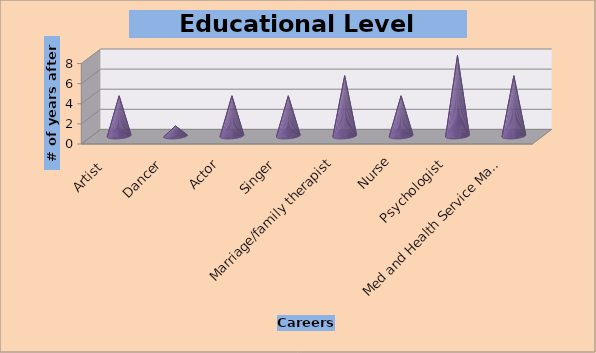
| Category | Educational Level Needed  No. of years after H.S. |
|---|---|
| Artist  | 4 |
| Dancer | 1 |
| Actor | 4 |
| Singer | 4 |
| Marriage/family therapist | 6 |
| Nurse | 4 |
| Psychologist | 8 |
| Med and Health Service Manager | 6 |